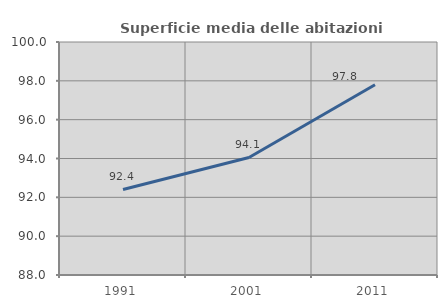
| Category | Superficie media delle abitazioni occupate |
|---|---|
| 1991.0 | 92.407 |
| 2001.0 | 94.053 |
| 2011.0 | 97.797 |